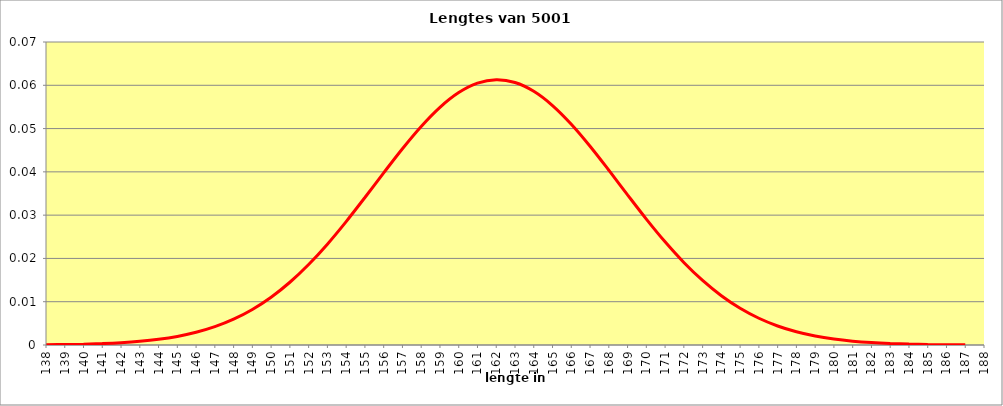
| Category | Series 0 |
|---|---|
| 138.0 | 0 |
| 139.0 | 0 |
| 140.0 | 0 |
| 141.0 | 0 |
| 142.0 | 0.001 |
| 143.0 | 0.001 |
| 144.0 | 0.001 |
| 145.0 | 0.002 |
| 146.0 | 0.003 |
| 147.0 | 0.004 |
| 148.0 | 0.006 |
| 149.0 | 0.008 |
| 150.0 | 0.011 |
| 151.0 | 0.014 |
| 152.0 | 0.019 |
| 153.0 | 0.023 |
| 154.0 | 0.029 |
| 155.0 | 0.034 |
| 156.0 | 0.04 |
| 157.0 | 0.045 |
| 158.0 | 0.05 |
| 159.0 | 0.055 |
| 160.0 | 0.058 |
| 161.0 | 0.06 |
| 162.0 | 0.061 |
| 163.0 | 0.061 |
| 164.0 | 0.059 |
| 165.0 | 0.055 |
| 166.0 | 0.051 |
| 167.0 | 0.046 |
| 168.0 | 0.04 |
| 169.0 | 0.035 |
| 170.0 | 0.029 |
| 171.0 | 0.024 |
| 172.0 | 0.019 |
| 173.0 | 0.015 |
| 174.0 | 0.011 |
| 175.0 | 0.008 |
| 176.0 | 0.006 |
| 177.0 | 0.004 |
| 178.0 | 0.003 |
| 179.0 | 0.002 |
| 180.0 | 0.001 |
| 181.0 | 0.001 |
| 182.0 | 0.001 |
| 183.0 | 0 |
| 184.0 | 0 |
| 185.0 | 0 |
| 186.0 | 0 |
| 187.0 | 0 |